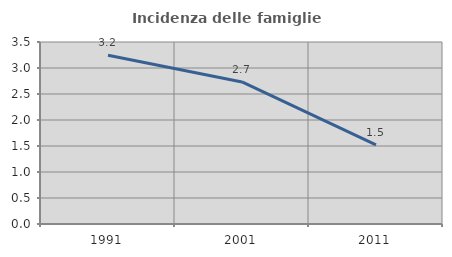
| Category | Incidenza delle famiglie numerose |
|---|---|
| 1991.0 | 3.247 |
| 2001.0 | 2.732 |
| 2011.0 | 1.523 |